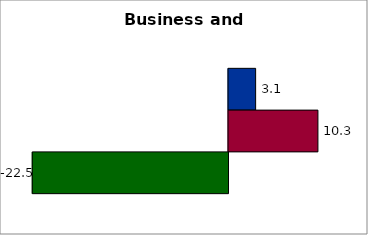
| Category | 50 states and D.C. | SREB states | State |
|---|---|---|---|
| 0 | 3.119 | 10.279 | -22.5 |